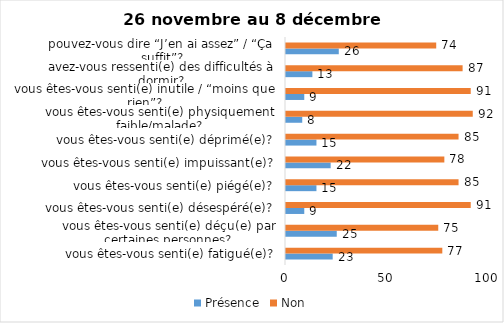
| Category | Présence | Non |
|---|---|---|
| vous êtes-vous senti(e) fatigué(e)? | 23 | 77 |
| vous êtes-vous senti(e) déçu(e) par certaines personnes? | 25 | 75 |
| vous êtes-vous senti(e) désespéré(e)? | 9 | 91 |
| vous êtes-vous senti(e) piégé(e)? | 15 | 85 |
| vous êtes-vous senti(e) impuissant(e)? | 22 | 78 |
| vous êtes-vous senti(e) déprimé(e)? | 15 | 85 |
| vous êtes-vous senti(e) physiquement faible/malade? | 8 | 92 |
| vous êtes-vous senti(e) inutile / “moins que rien”? | 9 | 91 |
| avez-vous ressenti(e) des difficultés à dormir? | 13 | 87 |
| pouvez-vous dire “J’en ai assez” / “Ça suffit”? | 26 | 74 |